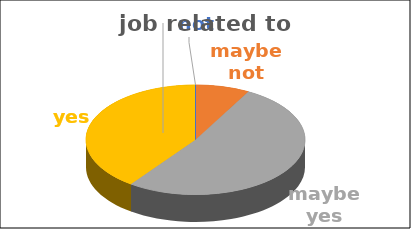
| Category | job related to studies | Series 1 | Series 2 | Series 3 | Series 4 |
|---|---|---|---|---|---|
| not | 0 |  |  |  |  |
| maybe not | 0.08 |  |  |  |  |
| maybe yes | 0.52 |  |  |  |  |
| yes | 0.4 |  |  |  |  |